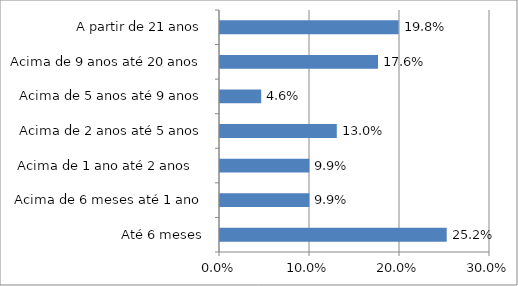
| Category | Series 0 |
|---|---|
| Até 6 meses | 0.252 |
| Acima de 6 meses até 1 ano | 0.099 |
| Acima de 1 ano até 2 anos   | 0.099 |
| Acima de 2 anos até 5 anos | 0.13 |
| Acima de 5 anos até 9 anos | 0.046 |
| Acima de 9 anos até 20 anos | 0.176 |
| A partir de 21 anos | 0.198 |